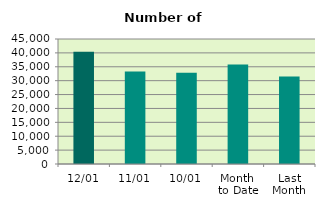
| Category | Series 0 |
|---|---|
| 12/01 | 40412 |
| 11/01 | 33342 |
| 10/01 | 32892 |
| Month 
to Date | 35845.778 |
| Last
Month | 31517.905 |